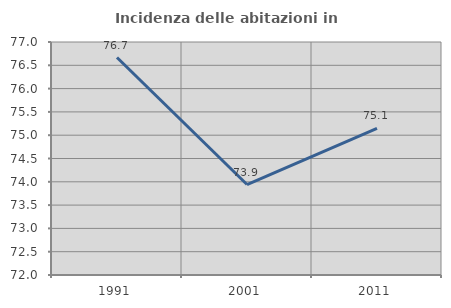
| Category | Incidenza delle abitazioni in proprietà  |
|---|---|
| 1991.0 | 76.667 |
| 2001.0 | 73.941 |
| 2011.0 | 75.145 |